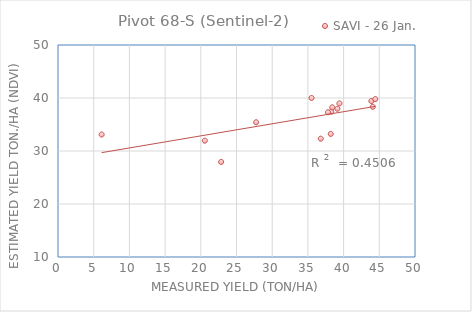
| Category | SAVI - 26 Jan. |
|---|---|
| 43.889999 | 39.423 |
| 35.509998 | 40.009 |
| 38.266998 | 37.412 |
| 27.753 | 35.423 |
| 22.85 | 27.934 |
| 39.126998 | 37.972 |
| 37.810001 | 37.304 |
| 36.799999 | 32.325 |
| 39.416999 | 38.981 |
| 44.432998 | 39.785 |
| 44.092998 | 38.345 |
| 38.2 | 33.223 |
| 20.559999 | 31.946 |
| 6.11 | 33.106 |
| 38.409999 | 38.242 |